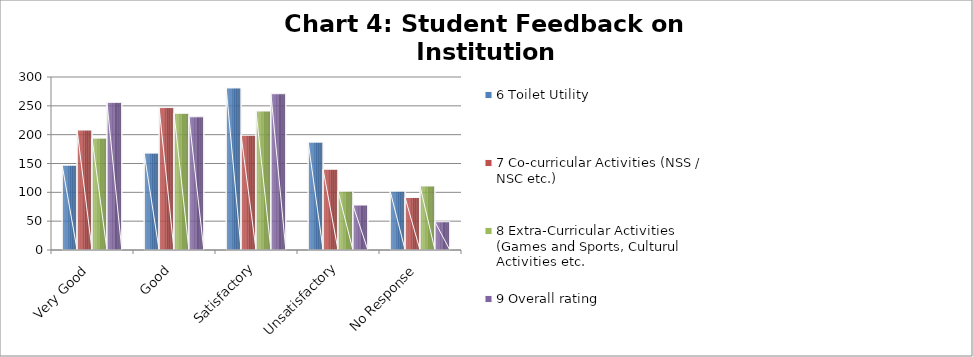
| Category | 6 Toilet Utility | 7 Co-curricular Activities (NSS / NSC etc.) | 8 Extra-Curricular Activities (Games and Sports, Culturul Activities etc. | 9 Overall rating |
|---|---|---|---|---|
| Very Good | 147 | 208 | 194 | 256 |
| Good | 168 | 247 | 237 | 231 |
| Satisfactory | 281 | 199 | 241 | 271 |
| Unsatisfactory | 187 | 140 | 102 | 78 |
| No Response | 102 | 91 | 111 | 49 |